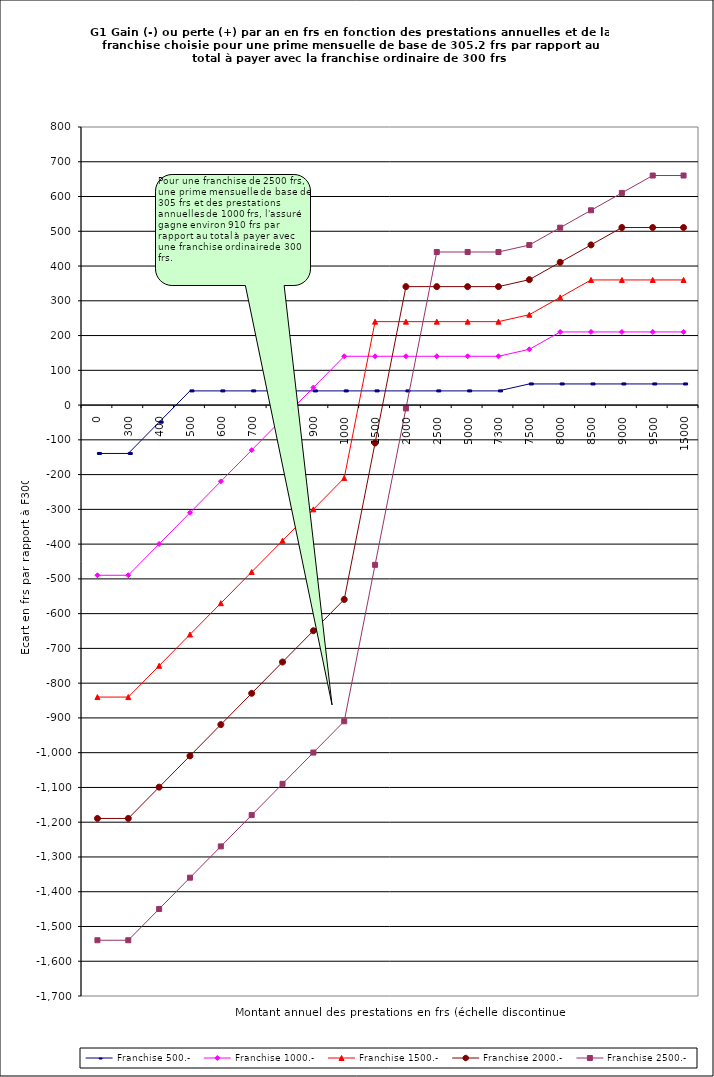
| Category | Franchise 500.- | Franchise 1000.- | Franchise 1500.- | Franchise 2000.- | Franchise 2500.- |
|---|---|---|---|---|---|
| 0.0 | -139.2 | -489.6 | -840 | -1189.2 | -1539.6 |
| 300.0 | -139.2 | -489.6 | -840 | -1189.2 | -1539.6 |
| 400.0 | -49.2 | -399.6 | -750 | -1099.2 | -1449.6 |
| 500.0 | 40.8 | -309.6 | -660 | -1009.2 | -1359.6 |
| 600.0 | 40.8 | -219.6 | -570 | -919.2 | -1269.6 |
| 700.0 | 40.8 | -129.6 | -480 | -829.2 | -1179.6 |
| 800.0 | 40.8 | -39.6 | -390 | -739.2 | -1089.6 |
| 900.0 | 40.8 | 50.4 | -300 | -649.2 | -999.6 |
| 1000.0 | 40.8 | 140.4 | -210 | -559.2 | -909.6 |
| 1500.0 | 40.8 | 140.4 | 240 | -109.2 | -459.6 |
| 2000.0 | 40.8 | 140.4 | 240 | 340.8 | -9.6 |
| 2500.0 | 40.8 | 140.4 | 240 | 340.8 | 440.4 |
| 5000.0 | 40.8 | 140.4 | 240 | 340.8 | 440.4 |
| 7300.0 | 40.8 | 140.4 | 240 | 340.8 | 440.4 |
| 7500.0 | 60.8 | 160.4 | 260 | 360.8 | 460.4 |
| 8000.0 | 60.8 | 210.4 | 310 | 410.8 | 510.4 |
| 8500.0 | 60.8 | 210.4 | 360 | 460.8 | 560.4 |
| 9000.0 | 60.8 | 210.4 | 360 | 510.8 | 610.4 |
| 9500.0 | 60.8 | 210.4 | 360 | 510.8 | 660.4 |
| 15000.0 | 60.8 | 210.4 | 360 | 510.8 | 660.4 |